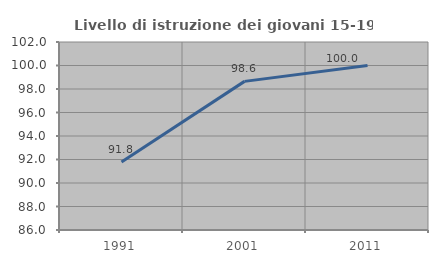
| Category | Livello di istruzione dei giovani 15-19 anni |
|---|---|
| 1991.0 | 91.791 |
| 2001.0 | 98.649 |
| 2011.0 | 100 |